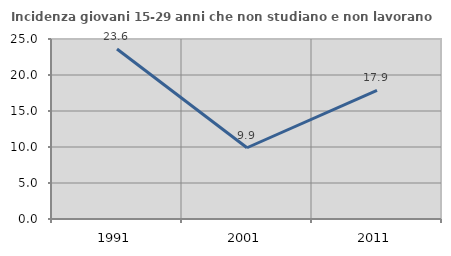
| Category | Incidenza giovani 15-29 anni che non studiano e non lavorano  |
|---|---|
| 1991.0 | 23.607 |
| 2001.0 | 9.896 |
| 2011.0 | 17.868 |